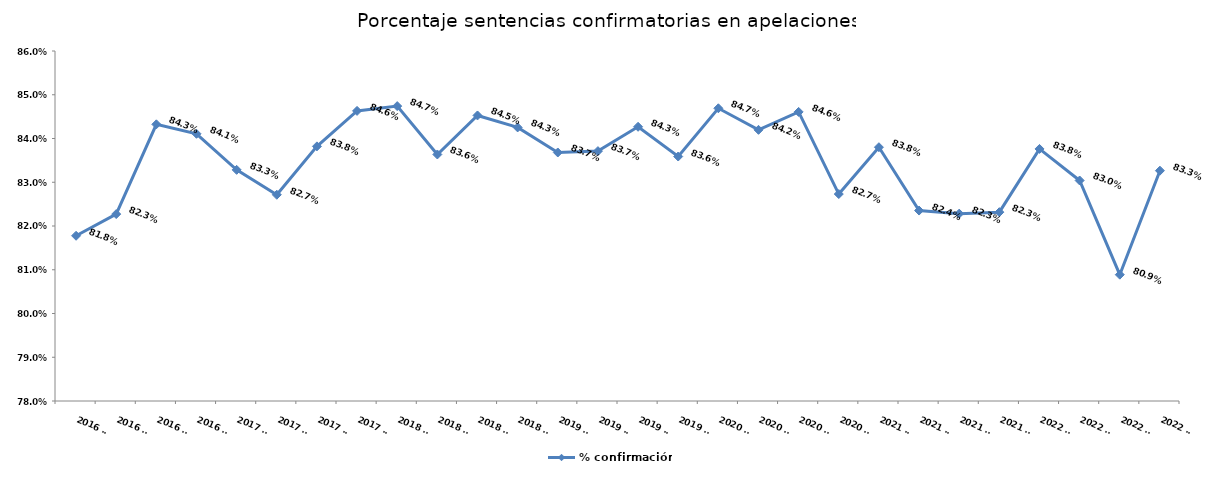
| Category | % confirmación |
|---|---|
| 2016 T1 | 0.818 |
| 2016 T2 | 0.823 |
| 2016 T3 | 0.843 |
| 2016 T4 | 0.841 |
| 2017 T1 | 0.833 |
| 2017 T2 | 0.827 |
| 2017 T3 | 0.838 |
| 2017 T4 | 0.846 |
| 2018 T1 | 0.847 |
| 2018 T2 | 0.836 |
| 2018 T3 | 0.845 |
| 2018 T4 | 0.843 |
| 2019 T1 | 0.837 |
| 2019 T2 | 0.837 |
| 2019 T3 | 0.843 |
| 2019 T4 | 0.836 |
| 2020 T1 | 0.847 |
| 2020 T2 | 0.842 |
| 2020 T3 | 0.846 |
| 2020 T4 | 0.827 |
| 2021 T1 | 0.838 |
| 2021 T2 | 0.824 |
| 2021 T3 | 0.823 |
| 2021 T4 | 0.823 |
| 2022 T1 | 0.838 |
| 2022 T2 | 0.83 |
| 2022 T3 | 0.809 |
| 2022 T4 | 0.833 |